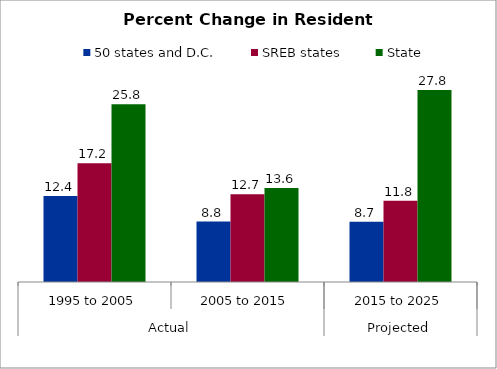
| Category | 50 states and D.C. | SREB states | State |
|---|---|---|---|
| 0 | 12.448 | 17.195 | 25.777 |
| 1 | 8.765 | 12.719 | 13.615 |
| 2 | 8.718 | 11.779 | 27.828 |